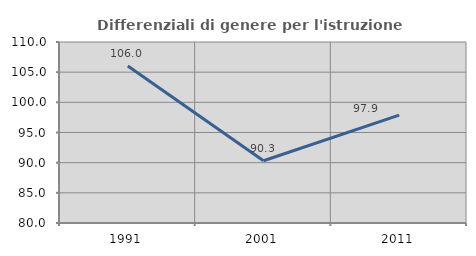
| Category | Differenziali di genere per l'istruzione superiore |
|---|---|
| 1991.0 | 106.031 |
| 2001.0 | 90.313 |
| 2011.0 | 97.868 |